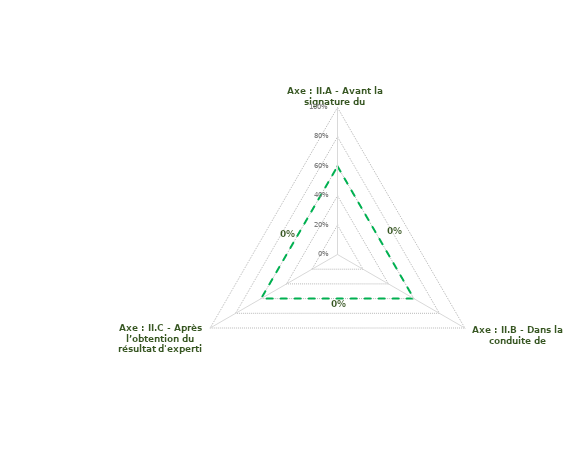
| Category | article 5 | Seuil limite |
|---|---|---|
| Axe : II.A - Avant la signature du contrat   | 0 | 0.6 |
| Axe : II.B - Dans la conduite de l’expertise | 0 | 0.6 |
| Axe : II.C - Après l’obtention du résultat d'expertise | 0 | 0.6 |